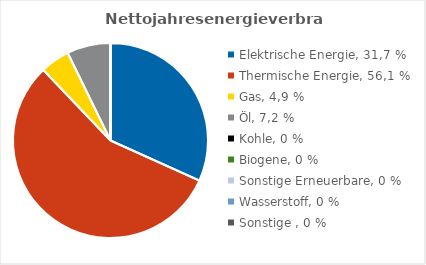
| Category | Nettojahresenergie-verbrauch [kWh/a] |
|---|---|
| Elektrische Energie, 31,7 % | 1638812 |
| Thermische Energie, 56,1 % | 2898057.04 |
| Gas, 4,9 % | 252004.96 |
| Öl, 7,2 % | 373600 |
| Kohle, 0 % | 0 |
| Biogene, 0 % | 0 |
| Sonstige Erneuerbare, 0 % | 0 |
| Wasserstoff, 0 % | 0 |
| Sonstige , 0 % | 0 |